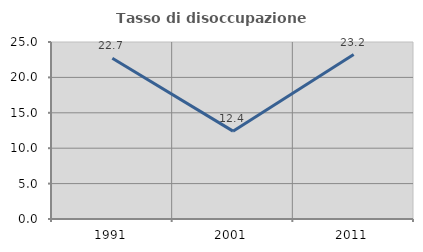
| Category | Tasso di disoccupazione giovanile  |
|---|---|
| 1991.0 | 22.706 |
| 2001.0 | 12.407 |
| 2011.0 | 23.231 |